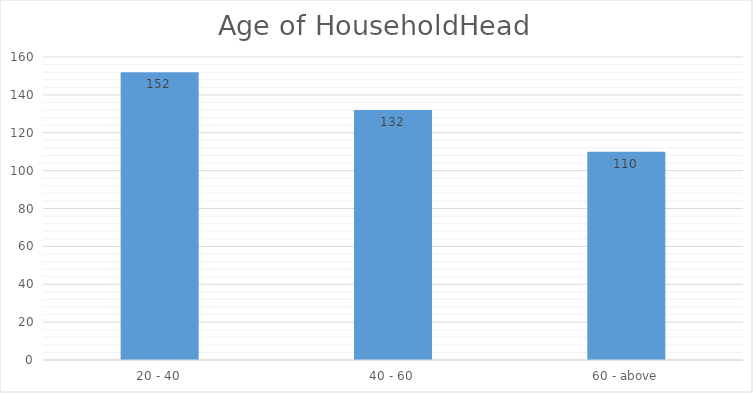
| Category | Age of HouseholdHead |
|---|---|
| 20 - 40 | 152 |
| 40 - 60 | 132 |
| 60 - above | 110 |